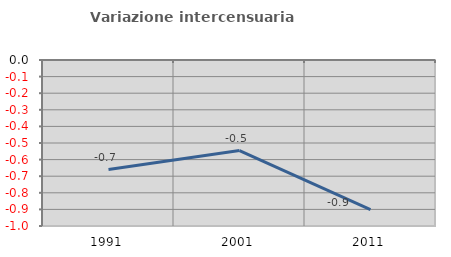
| Category | Variazione intercensuaria annua |
|---|---|
| 1991.0 | -0.66 |
| 2001.0 | -0.546 |
| 2011.0 | -0.902 |